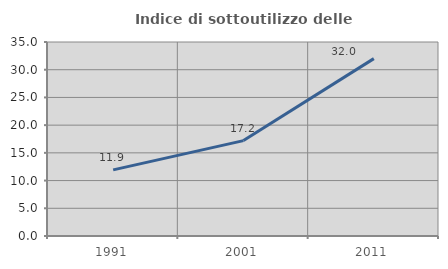
| Category | Indice di sottoutilizzo delle abitazioni  |
|---|---|
| 1991.0 | 11.932 |
| 2001.0 | 17.213 |
| 2011.0 | 32 |